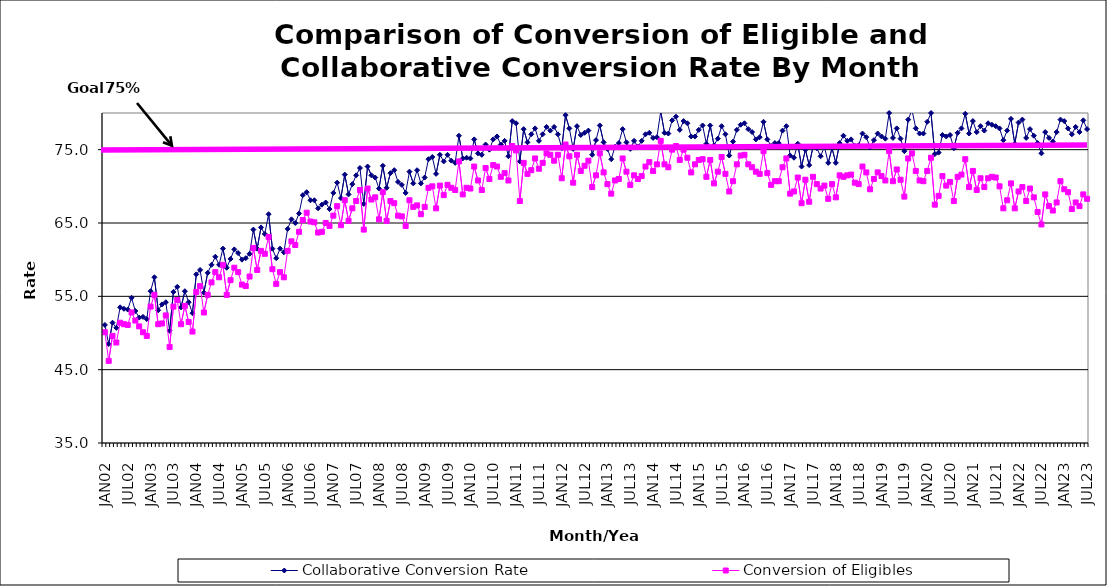
| Category | Collaborative Conversion Rate | Conversion of Eligibles |
|---|---|---|
| JAN02 | 51.1 | 50.1 |
| FEB02 | 48.5 | 46.2 |
| MAR02 | 51.4 | 49.6 |
| APR02 | 50.7 | 48.7 |
| MAY02 | 53.5 | 51.4 |
| JUN02 | 53.3 | 51.2 |
| JUL02 | 53.2 | 51.1 |
| AUG02 | 54.8 | 52.8 |
| SEP02 | 53 | 51.7 |
| OCT02 | 52.1 | 50.9 |
| NOV02 | 52.2 | 50.1 |
| DEC02 | 51.9 | 49.6 |
| JAN03 | 55.7 | 53.6 |
| FEB03 | 57.6 | 55.2 |
| MAR03 | 53.1 | 51.2 |
| APR03 | 53.9 | 51.3 |
| MAY03 | 54.2 | 52.4 |
| JUN03 | 50.3 | 48.1 |
| JUL03 | 55.6 | 53.6 |
| AUG03 | 56.3 | 54.5 |
| SEP03 | 53.5 | 51.2 |
| OCT03 | 55.7 | 53.7 |
| NOV03 | 54.2 | 51.5 |
| DEC03 | 52.7 | 50.2 |
| JAN04 | 58 | 55.6 |
| FEB04 | 58.6 | 56.4 |
| MAR04 | 55.5 | 52.8 |
| APR04 | 58.2 | 55.2 |
| MAY04 | 59.3 | 56.9 |
| JUN04 | 60.4 | 58.3 |
| JUL04 | 59.3 | 57.6 |
| AUG04 | 61.5 | 59.3 |
| SEP04 | 58.9 | 55.2 |
| OCT04 | 60.1 | 57.2 |
| NOV04 | 61.4 | 58.9 |
| DEC04 | 60.9 | 58.3 |
| JAN05 | 60 | 56.6 |
| FEB05 | 60.2 | 56.4 |
| MAR05 | 60.8 | 57.7 |
| APR05 | 64.1 | 61.6 |
| MAY05 | 61.5 | 58.6 |
| JUN05 | 64.4 | 61.2 |
| JUL05 | 63.5 | 60.8 |
| AUG05 | 66.2 | 63.1 |
| SEP05 | 61.5 | 58.7 |
| OCT05 | 60.2 | 56.7 |
| NOV05 | 61.5 | 58.3 |
| DEC05 | 61 | 57.6 |
| JAN06 | 64.2 | 61.2 |
| FEB06 | 65.5 | 62.5 |
| MAR06 | 65 | 62 |
| APR06 | 66.3 | 63.8 |
| MAY06 | 68.8 | 65.4 |
| JUN06 | 69.2 | 66.4 |
| JUL06 | 68.1 | 65.2 |
| AUG06 | 68.1 | 65.1 |
| SEP06 | 67 | 63.7 |
| OCT06 | 67.5 | 63.8 |
| NOV06 | 67.8 | 65 |
| DEC06 | 66.9 | 64.6 |
| JAN07 | 69.1 | 66 |
| FEB07 | 70.5 | 67.3 |
| MAR07 | 68.4 | 64.7 |
| APR07 | 71.6 | 68.1 |
| MAY07 | 68.9 | 65.3 |
| JUN07 | 70.3 | 67 |
| JUL07 | 71.5 | 68 |
| AUG07 | 72.5 | 69.5 |
| SEP07 | 67.6 | 64.1 |
| OCT07 | 72.7 | 69.7 |
| NOV07 | 71.5 | 68.2 |
| DEC07 | 71.2 | 68.5 |
| JAN08 | 69.7 | 65.5 |
| FEB08 | 72.8 | 69.2 |
| MAR08 | 69.8 | 65.3 |
| APR08 | 71.8 | 68 |
| MAY08 | 72.2 | 67.7 |
| JUN08 | 70.6 | 66 |
| JUL08 | 70.2 | 65.9 |
| AUG08 | 69.1 | 64.6 |
| SEP08 | 72 | 68.1 |
| OCT08 | 70.4 | 67.2 |
| NOV08 | 72.2 | 67.4 |
| DEC08 | 70.4 | 66.2 |
| JAN09 | 71.2 | 67.2 |
| FEB09 | 73.7 | 69.8 |
| MAR09 | 74 | 70 |
| APR09 | 71.7 | 67 |
| MAY09 | 74.3 | 70.1 |
| JUN09 | 73.4 | 68.8 |
| JUL09 | 74.3 | 70.2 |
| AUG09 | 73.5 | 69.8 |
| SEP09 | 73.2 | 69.5 |
| OCT09 | 76.9 | 73.4 |
| NOV09 | 73.8 | 68.9 |
| DEC09 | 73.9 | 69.8 |
| JAN10 | 73.8 | 69.7 |
| FEB10 | 76.4 | 72.7 |
| MAR10 | 74.5 | 70.8 |
| APR10 | 74.3 | 69.5 |
| MAY10 | 75.7 | 72.5 |
| JUN10 | 75 | 71 |
| JUL10 | 76.4 | 72.9 |
| AUG10 | 76.8 | 72.7 |
| SEP10 | 75.7 | 71.3 |
| OCT10 | 76.2 | 71.8 |
| NOV10 | 74.1 | 70.8 |
| DEC10 | 78.9 | 75.5 |
| JAN11 | 78.6 | 74.9 |
| FEB11 | 73.4 | 68 |
| MAR11 | 77.8 | 73.2 |
| APR11 | 76 | 71.7 |
| MAY11 | 77.1 | 72.2 |
| JUN11 | 77.9 | 73.8 |
| JUL11 | 76.2 | 72.4 |
| AUG11 | 77.1 | 73.2 |
| SEP11 | 78.1 | 74.5 |
| OCT11 | 77.6 | 74.3 |
| NOV11 | 78.1 | 73.5 |
| DEC11 | 77.1 | 74.3 |
| JAN12 | 75.2 | 71.1 |
| FEB12 | 79.7 | 75.7 |
| MAR12 | 77.9 | 74.1 |
| APR12 | 75.1 | 70.5 |
| MAY12 | 78.2 | 74.3 |
| JUN12 | 77 | 72.1 |
| JUL12 | 77.3 | 72.8 |
| AUG12 | 77.6 | 73.5 |
| SEP12 | 74.3 | 69.9 |
| OCT12 | 76.3 | 71.5 |
| NOV12 | 78.3 | 74.5 |
| DEC12 | 76 | 71.9 |
| JAN13 | 75.1 | 70.3 |
| FEB13 | 73.7 | 69 |
| MAR13 | 75.4 | 70.8 |
| APR13 | 75.9 | 71 |
| MAY13 | 77.8 | 73.8 |
| JUN13 | 76 | 72 |
| JUL13 | 75.1 | 70.2 |
| AUG13 | 76.2 | 71.5 |
| SEP13 | 75.4 | 71 |
| OCT13 | 76.2 | 71.4 |
| NOV13 | 77.1 | 72.7 |
| DEC13 | 77.3 | 73.3 |
| JAN14 | 76.6 | 72.1 |
| FEB14 | 76.7 | 73 |
| MAR14 | 80.2 | 76.2 |
| APR14 | 77.3 | 73 |
| MAY14 | 77.2 | 72.6 |
| JUN14 | 79 | 75 |
| JUL14 | 79.5 | 75.5 |
| AUG14 | 77.7 | 73.6 |
| SEP14 | 78.9 | 75 |
| OCT14 | 78.6 | 73.9 |
| NOV14 | 76.8 | 71.9 |
| DEC14 | 76.8 | 73 |
| JAN15 | 77.7 | 73.6 |
| FEB15 | 78.3 | 73.7 |
| MAR15 | 75.8 | 71.3 |
| APR15 | 78.3 | 73.6 |
| MAY15 | 75.6 | 70.4 |
| JUN15 | 76.5 | 72 |
| JUL15 | 78.2 | 74 |
| AUG15 | 77.1 | 71.7 |
| SEP15 | 74.2 | 69.3 |
| OCT15 | 76.1 | 70.7 |
| NOV15 | 77.7 | 73 |
| DEC15 | 78.4 | 74.2 |
| JAN16 | 78.6 | 74.3 |
| FEB16 | 77.8 | 73 |
| MAR16 | 77.4 | 72.6 |
| APR16 | 76.4 | 72 |
| MAY16 | 76.7 | 71.7 |
| JUN16 | 78.8 | 74.8 |
| JUL16 | 76.4 | 71.8 |
| AUG16 | 75.5 | 70.2 |
| SEP16 | 75.9 | 70.7 |
| OCT16 | 75.9 | 70.7 |
| NOV16 | 77.6 | 72.6 |
| DEC16 | 78.2 | 73.8 |
| JAN17 | 74.2 | 69 |
| FEB17 | 73.9 | 69.3 |
| MAR17 | 75.8 | 71.2 |
| APR17 | 72.7 | 67.7 |
| MAY17 | 75 | 70.9 |
| JUN17 | 72.9 | 67.9 |
| JUL17 | 75.4 | 71.3 |
| AUG17 | 75.2 | 70.3 |
| SEP17 | 74.1 | 69.7 |
| OCT17 | 75.4 | 70.1 |
| NOV17 | 73.2 | 68.3 |
| DEC17 | 75.2 | 70.3 |
| JAN18 | 73.2 | 68.5 |
| FEB18 | 75.9 | 71.5 |
| MAR18 | 76.9 | 71.3 |
| APR18 | 76.2 | 71.5 |
| MAY18 | 76.4 | 71.6 |
| JUN18 | 75.5 | 70.5 |
| JUL18 | 75.6 | 70.3 |
| AUG18 | 77.2 | 72.7 |
| SEP18 | 76.7 | 71.9 |
| OCT18 | 75.3 | 69.6 |
| NOV18 | 76.3 | 71 |
| DEC18 | 77.2 | 71.9 |
| JAN19 | 76.8 | 71.4 |
| FEB19 | 76.5 | 70.8 |
| MAR19 | 80 | 74.8 |
| APR19 | 76.6 | 70.7 |
| MAY19 | 77.9 | 72.3 |
| JUN19 | 76.5 | 70.9 |
| JUL19 | 74.8 | 68.6 |
| AUG19 | 79.1 | 73.8 |
| SEP19 | 80.4 | 74.5 |
| OCT19 | 77.9 | 72.1 |
| NOV19 | 77.2 | 70.8 |
| DEC19 | 77.2 | 70.7 |
| JAN20 | 78.8 | 72.1 |
| FEB20 | 80 | 73.9 |
| MAR20 | 74.4 | 67.5 |
| APR20 | 74.6 | 68.7 |
| MAY20 | 77 | 71.4 |
| JUN20 | 76.8 | 70.1 |
| JUL20 | 77 | 70.6 |
| AUG20 | 75.2 | 68 |
| SEP20 | 77.3 | 71.3 |
| OCT20 | 77.9 | 71.6 |
| NOV20 | 79.9 | 73.7 |
| DEC20 | 77.2 | 69.9 |
| JAN21 | 78.9 | 72.1 |
| FEB21 | 77.4 | 69.5 |
| MAR21 | 78.2 | 71.1 |
| APR21 | 77.6 | 69.9 |
| MAY21 | 78.6 | 71.1 |
| JUN21 | 78.4 | 71.3 |
| JUL21 | 78.2 | 71.2 |
| AUG21 | 77.9 | 70 |
| SEP21 | 76.3 | 67 |
| OCT21 | 77.6 | 68.1 |
| NOV21 | 79.2 | 70.4 |
| DEC21 | 75.8 | 67 |
| JAN22 | 78.7 | 69.3 |
| FEB22 | 79.1 | 69.9 |
| MAR22 | 76.6 | 68 |
| APR22 | 77.8 | 69.7 |
| MAY22 | 76.9 | 68.5 |
| JUN22 | 75.9 | 66.5 |
| JUL22 | 74.5 | 64.8 |
| AUG22 | 77.4 | 68.9 |
| SEP22 | 76.6 | 67.3 |
| OCT22 | 76.1 | 66.7 |
| NOV22 | 77.4 | 67.8 |
| DEC22 | 79.1 | 70.7 |
| JAN23 | 78.9 | 69.6 |
| FEB23 | 77.9 | 69.2 |
| MAR23 | 77.1 | 66.9 |
| APR23 | 78.1 | 67.8 |
| MAY23 | 77.4 | 67.3 |
| JUN23 | 79 | 68.9 |
| JUL23 | 77.8 | 68.3 |